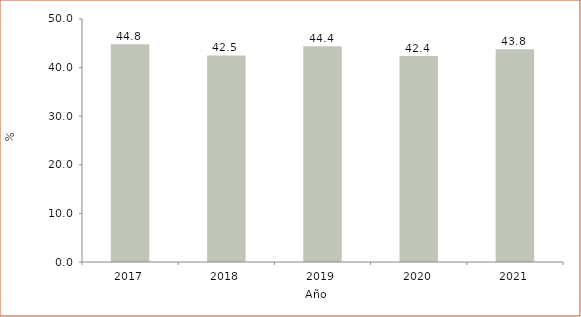
| Category | Series 1 |
|---|---|
| 2017.0 | 44.8 |
| 2018.0 | 42.5 |
| 2019.0 | 44.4 |
| 2020.0 | 42.4 |
| 2021.0 | 43.8 |